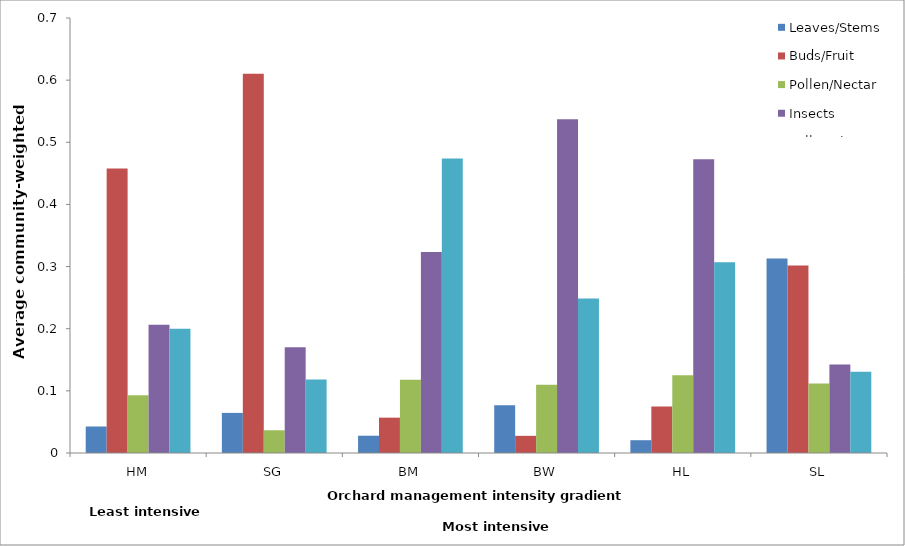
| Category | Leaves/Stems | Buds/Fruit | Pollen/Nectar | Insects | Pollen+insects |
|---|---|---|---|---|---|
| HM | 0.043 | 0.458 | 0.093 | 0.206 | 0.2 |
| SG | 0.065 | 0.61 | 0.037 | 0.17 | 0.118 |
| BM | 0.028 | 0.057 | 0.118 | 0.324 | 0.474 |
| BW | 0.077 | 0.028 | 0.11 | 0.537 | 0.249 |
| HL | 0.021 | 0.075 | 0.125 | 0.473 | 0.307 |
| SL | 0.313 | 0.302 | 0.112 | 0.142 | 0.131 |